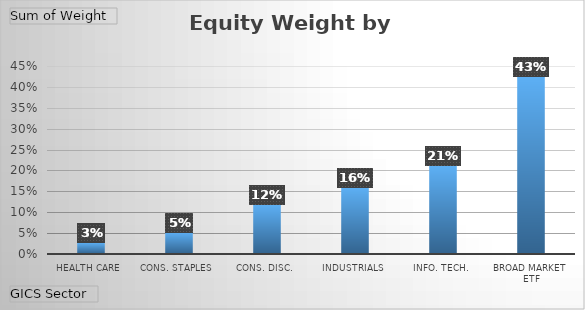
| Category | Total |
|---|---|
| Health Care | 0.028 |
| Cons. Staples | 0.053 |
| Cons. Disc. | 0.119 |
| Industrials | 0.161 |
| Info. Tech. | 0.212 |
| Broad Market ETF | 0.427 |